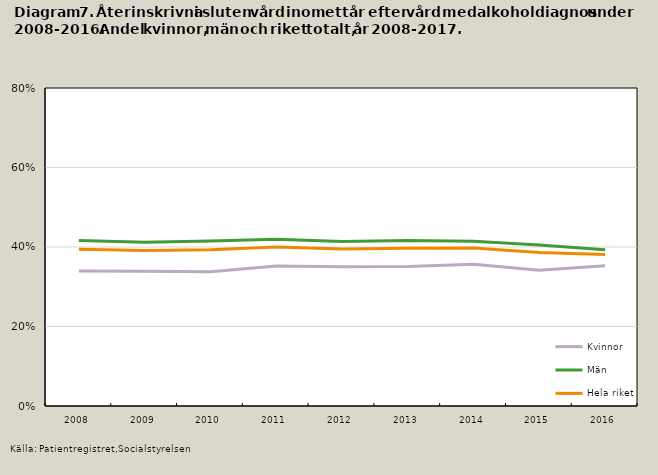
| Category | Kvinnor | Män | Hela riket |
|---|---|---|---|
| 2008.0 | 0.339 | 0.416 | 0.394 |
| 2009.0 | 0.339 | 0.412 | 0.391 |
| 2010.0 | 0.338 | 0.415 | 0.393 |
| 2011.0 | 0.352 | 0.419 | 0.4 |
| 2012.0 | 0.35 | 0.414 | 0.395 |
| 2013.0 | 0.351 | 0.417 | 0.397 |
| 2014.0 | 0.357 | 0.415 | 0.398 |
| 2015.0 | 0.341 | 0.405 | 0.386 |
| 2016.0 | 0.353 | 0.393 | 0.381 |